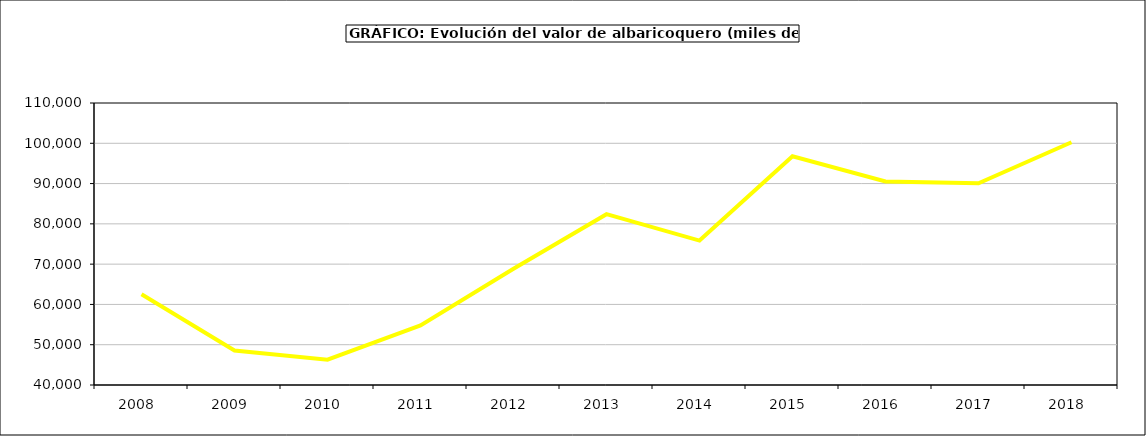
| Category | valor albaricoquero |
|---|---|
| 2008.0 | 62518.884 |
| 2009.0 | 48553.188 |
| 2010.0 | 46289.905 |
| 2011.0 | 54777.84 |
| 2012.0 | 68866.776 |
| 2013.0 | 82399.533 |
| 2014.0 | 75850.331 |
| 2015.0 | 96779 |
| 2016.0 | 90534 |
| 2017.0 | 90084.503 |
| 2018.0 | 100255.554 |